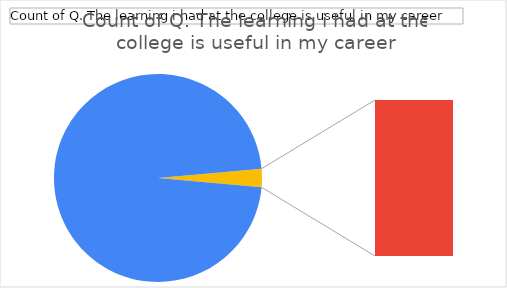
| Category | Total |
|---|---|
| Agree | 102 |
| Neutral | 3 |